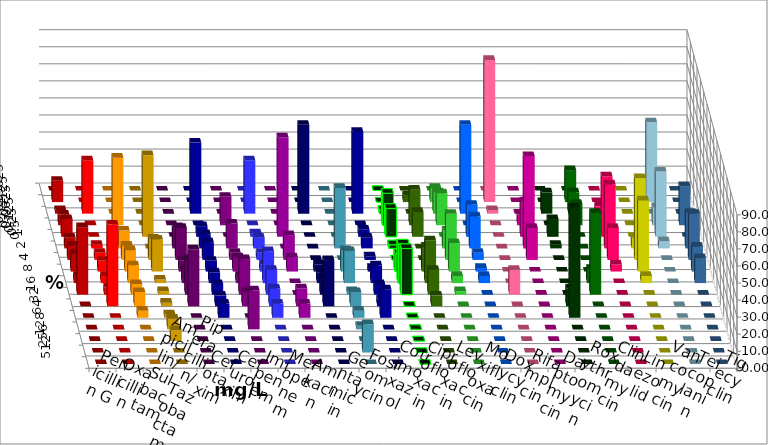
| Category | Penicillin G | Oxacillin | Ampicillin/ Sulbactam | Piperacillin/ Tazobactam | Cefotaxim | Cefuroxim | Imipenem | Meropenem | Amikacin | Gentamicin | Fosfomycin | Cotrimoxazol | Ciprofloxacin | Levofloxacin | Moxifloxacin | Doxycyclin | Rifampicin | Daptomycin | Roxythromycin | Clindamycin | Linezolid | Vancomycin | Teicoplanin | Tigecyclin |
|---|---|---|---|---|---|---|---|---|---|---|---|---|---|---|---|---|---|---|---|---|---|---|---|---|
| 0.015625 | 0 | 0 | 0 | 0 | 0 | 0 | 0 | 0 | 0 | 0 | 0 | 0 | 0 | 0 | 0 | 0 | 0 | 0 | 0 | 0 | 0 | 0 | 0 | 0 |
| 0.03125 | 12.5 | 0 | 0 | 0 | 0 | 0 | 0 | 0 | 0 | 0 | 0 | 0 | 0 | 4.167 | 8.333 | 0 | 83.333 | 0 | 0 | 18.75 | 0 | 0 | 0 | 46.809 |
| 0.0625 | 2.083 | 31.25 | 0 | 0 | 0 | 0 | 41.667 | 31.25 | 0 | 52.083 | 0 | 47.917 | 2.083 | 0 | 12.5 | 52.083 | 2.083 | 0 | 12.5 | 12.5 | 4.167 | 0 | 0 | 0 |
| 0.125 | 6.25 | 0 | 39.583 | 0 | 0 | 16.667 | 0 | 0 | 0 | 0 | 0 | 0 | 18.75 | 20.833 | 18.75 | 0 | 0 | 6.25 | 0 | 12.5 | 0 | 0 | 22.917 | 10.638 |
| 0.25 | 10.417 | 0 | 0 | 47.917 | 0 | 0 | 6.25 | 2.083 | 58.333 | 0 | 0 | 4.167 | 16.667 | 14.583 | 0 | 18.75 | 0 | 20.833 | 10.417 | 0 | 35.417 | 0 | 0 | 38.298 |
| 0.5 | 6.25 | 2.083 | 10.417 | 0 | 12.5 | 14.583 | 8.333 | 6.25 | 0 | 0 | 35.417 | 6.25 | 2.083 | 0 | 10.417 | 18.75 | 0 | 54.167 | 2.083 | 0 | 37.5 | 6.25 | 20.833 | 4.255 |
| 1.0 | 8.333 | 4.167 | 8.333 | 12.5 | 18.75 | 4.167 | 10.417 | 4.167 | 14.583 | 0 | 0 | 2.083 | 0 | 0 | 27.083 | 4.167 | 0 | 18.75 | 0 | 0 | 18.75 | 47.917 | 27.083 | 0 |
| 2.0 | 10.417 | 6.25 | 12.5 | 18.75 | 6.25 | 8.333 | 6.25 | 4.167 | 8.333 | 4.167 | 12.5 | 2.083 | 10.417 | 14.583 | 16.667 | 2.083 | 0 | 0 | 0 | 0 | 4.167 | 41.667 | 14.583 | 0 |
| 4.0 | 4.167 | 4.167 | 10.417 | 2.083 | 8.333 | 4.167 | 6.25 | 18.75 | 0 | 6.25 | 18.75 | 10.417 | 22.917 | 25 | 4.167 | 4.167 | 0 | 0 | 0 | 8.333 | 0 | 4.167 | 14.583 | 0 |
| 8.0 | 39.583 | 4.167 | 6.25 | 2.083 | 20.833 | 20.833 | 6.25 | 14.583 | 0 | 10.417 | 2.083 | 6.25 | 27.083 | 14.583 | 2.083 | 0 | 14.583 | 0 | 0 | 47.917 | 0 | 0 | 0 | 0 |
| 16.0 | 0 | 47.917 | 8.333 | 2.083 | 33.333 | 8.333 | 6.25 | 10.417 | 10.417 | 27.083 | 8.333 | 4.167 | 0 | 6.25 | 0 | 0 | 0 | 0 | 10.417 | 0 | 0 | 0 | 0 | 0 |
| 32.0 | 0 | 0 | 4.167 | 2.083 | 0 | 0 | 8.333 | 8.333 | 8.333 | 0 | 4.167 | 16.667 | 0 | 0 | 0 | 0 | 0 | 0 | 64.583 | 0 | 0 | 0 | 0 | 0 |
| 64.0 | 0 | 0 | 0 | 6.25 | 0 | 22.917 | 0 | 0 | 0 | 0 | 2.083 | 0 | 0 | 0 | 0 | 0 | 0 | 0 | 0 | 0 | 0 | 0 | 0 | 0 |
| 128.0 | 0 | 0 | 0 | 6.25 | 0 | 0 | 0 | 0 | 0 | 0 | 0 | 0 | 0 | 0 | 0 | 0 | 0 | 0 | 0 | 0 | 0 | 0 | 0 | 0 |
| 256.0 | 0 | 0 | 0 | 0 | 0 | 0 | 0 | 0 | 0 | 0 | 16.667 | 0 | 0 | 0 | 0 | 0 | 0 | 0 | 0 | 0 | 0 | 0 | 0 | 0 |
| 512.0 | 0 | 0 | 0 | 0 | 0 | 0 | 0 | 0 | 0 | 0 | 0 | 0 | 0 | 0 | 0 | 0 | 0 | 0 | 0 | 0 | 0 | 0 | 0 | 0 |